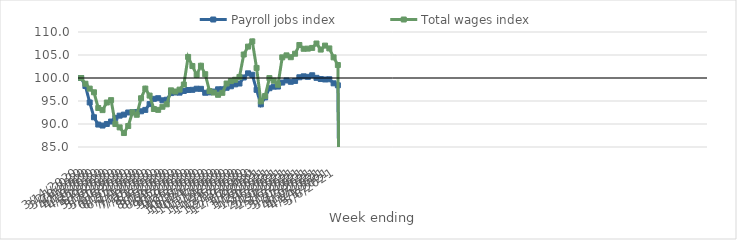
| Category | Payroll jobs index | Total wages index |
|---|---|---|
| 14/03/2020 | 100 | 100 |
| 21/03/2020 | 98.263 | 98.754 |
| 28/03/2020 | 94.679 | 97.695 |
| 04/04/2020 | 91.466 | 96.895 |
| 11/04/2020 | 89.878 | 93.475 |
| 18/04/2020 | 89.664 | 93.019 |
| 25/04/2020 | 90.009 | 94.67 |
| 02/05/2020 | 90.538 | 95.19 |
| 09/05/2020 | 91.332 | 89.988 |
| 16/05/2020 | 91.817 | 89.266 |
| 23/05/2020 | 92.04 | 88.038 |
| 30/05/2020 | 92.502 | 89.56 |
| 06/06/2020 | 92.549 | 92.531 |
| 13/06/2020 | 92.606 | 92.005 |
| 20/06/2020 | 92.764 | 95.595 |
| 27/06/2020 | 93.067 | 97.701 |
| 04/07/2020 | 94.33 | 96.176 |
| 11/07/2020 | 95.469 | 93.259 |
| 18/07/2020 | 95.607 | 93.077 |
| 25/07/2020 | 95.152 | 93.748 |
| 01/08/2020 | 95.278 | 94.273 |
| 08/08/2020 | 96.719 | 97.32 |
| 15/08/2020 | 96.853 | 97.068 |
| 22/08/2020 | 96.819 | 97.473 |
| 29/08/2020 | 97.179 | 98.578 |
| 05/09/2020 | 97.391 | 104.581 |
| 12/09/2020 | 97.43 | 102.599 |
| 19/09/2020 | 97.668 | 100.662 |
| 26/09/2020 | 97.645 | 102.673 |
| 03/10/2020 | 96.793 | 100.824 |
| 10/10/2020 | 96.878 | 97.163 |
| 17/10/2020 | 97.056 | 96.834 |
| 24/10/2020 | 97.543 | 96.348 |
| 31/10/2020 | 97.553 | 96.779 |
| 07/11/2020 | 97.873 | 98.801 |
| 14/11/2020 | 98.201 | 99.326 |
| 21/11/2020 | 98.612 | 99.619 |
| 28/11/2020 | 98.799 | 100.23 |
| 05/12/2020 | 100.11 | 105.106 |
| 12/12/2020 | 101.013 | 106.826 |
| 19/12/2020 | 100.702 | 107.96 |
| 26/12/2020 | 97.43 | 102.193 |
| 02/01/2021 | 94.271 | 94.923 |
| 09/01/2021 | 95.784 | 96.088 |
| 16/01/2021 | 97.777 | 99.982 |
| 23/01/2021 | 98.116 | 99.42 |
| 30/01/2021 | 98.143 | 98.543 |
| 06/02/2021 | 99.009 | 104.488 |
| 13/02/2021 | 99.463 | 104.92 |
| 20/02/2021 | 99.178 | 104.52 |
| 27/02/2021 | 99.363 | 105.28 |
| 06/03/2021 | 100.158 | 107.174 |
| 13/03/2021 | 100.361 | 106.351 |
| 20/03/2021 | 100.253 | 106.385 |
| 27/03/2021 | 100.591 | 106.541 |
| 03/04/2021 | 100.034 | 107.498 |
| 10/04/2021 | 99.777 | 106.177 |
| 17/04/2021 | 99.679 | 107.044 |
| 24/04/2021 | 99.722 | 106.432 |
| 01/05/2021 | 98.841 | 104.494 |
| 08/05/2021 | 98.417 | 102.822 |